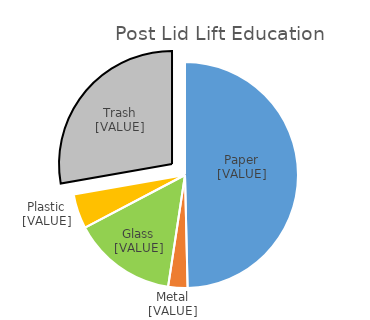
| Category | Series 0 |
|---|---|
| Paper | 0.496 |
| Metals | 0.028 |
| Glass | 0.149 |
| Plastic | 0.05 |
| Trash  | 0.278 |